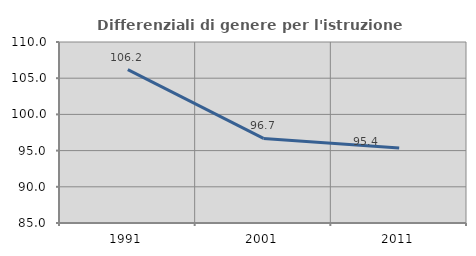
| Category | Differenziali di genere per l'istruzione superiore |
|---|---|
| 1991.0 | 106.19 |
| 2001.0 | 96.679 |
| 2011.0 | 95.356 |